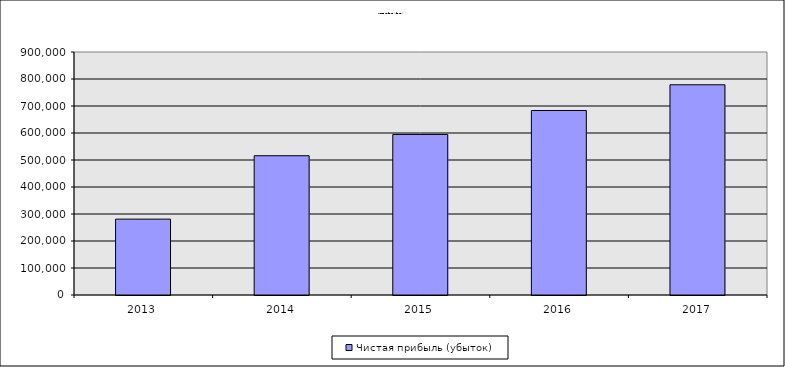
| Category | Чистая прибыль (убыток) |
|---|---|
| 2013.0 | 280970.56 |
| 2014.0 | 515825.589 |
| 2015.0 | 594575.684 |
| 2016.0 | 683317.845 |
| 2017.0 | 778635.494 |